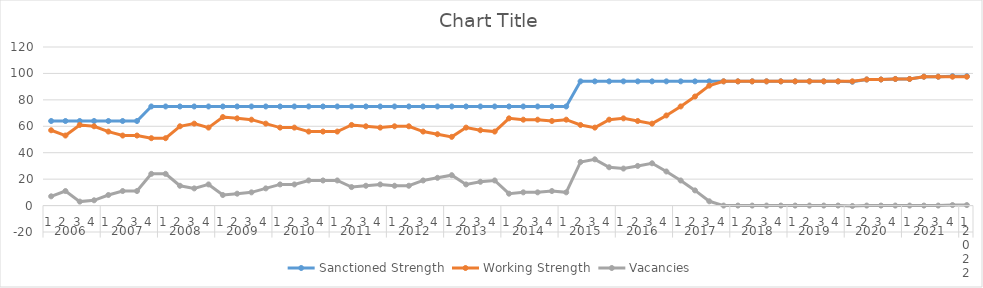
| Category | Sanctioned Strength | Working Strength | Vacancies |
|---|---|---|---|
| 0 | 64 | 57 | 7 |
| 1 | 64 | 53 | 11 |
| 2 | 64 | 61 | 3 |
| 3 | 64 | 60 | 4 |
| 4 | 64 | 56 | 8 |
| 5 | 64 | 53 | 11 |
| 6 | 64 | 53 | 11 |
| 7 | 75 | 51 | 24 |
| 8 | 75 | 51 | 24 |
| 9 | 75 | 60 | 15 |
| 10 | 75 | 62 | 13 |
| 11 | 75 | 59 | 16 |
| 12 | 75 | 67 | 8 |
| 13 | 75 | 66 | 9 |
| 14 | 75 | 65 | 10 |
| 15 | 75 | 62 | 13 |
| 16 | 75 | 59 | 16 |
| 17 | 75 | 59 | 16 |
| 18 | 75 | 56 | 19 |
| 19 | 75 | 56 | 19 |
| 20 | 75 | 56 | 19 |
| 21 | 75 | 61 | 14 |
| 22 | 75 | 60 | 15 |
| 23 | 75 | 59 | 16 |
| 24 | 75 | 60 | 15 |
| 25 | 75 | 60 | 15 |
| 26 | 75 | 56 | 19 |
| 27 | 75 | 54 | 21 |
| 28 | 75 | 52 | 23 |
| 29 | 75 | 59 | 16 |
| 30 | 75 | 57 | 18 |
| 31 | 75 | 56 | 19 |
| 32 | 75 | 66 | 9 |
| 33 | 75 | 65 | 10 |
| 34 | 75 | 65 | 10 |
| 35 | 75 | 64 | 11 |
| 36 | 75 | 65 | 10 |
| 37 | 94 | 61 | 33 |
| 38 | 94 | 59 | 35 |
| 39 | 94 | 65 | 29 |
| 40 | 94 | 66 | 28 |
| 41 | 94 | 64 | 30 |
| 42 | 94 | 62 | 32 |
| 43 | 94 | 68.2 | 25.8 |
| 44 | 94 | 75.02 | 18.98 |
| 45 | 94 | 82.522 | 11.478 |
| 46 | 94 | 90.774 | 3.226 |
| 47 | 94 | 94 | 0 |
| 48 | 94 | 94 | 0 |
| 49 | 94 | 94 | 0 |
| 50 | 94 | 94 | 0 |
| 51 | 94 | 94 | 0 |
| 52 | 94 | 94 | 0 |
| 53 | 94 | 94 | 0 |
| 54 | 94 | 94 | 0 |
| 55 | 94 | 94 | 0 |
| 56 | 93.687 | 94 | -0.313 |
| 57 | 95.415 | 95.415 | 0 |
| 58 | 95.415 | 95.415 | 0 |
| 59 | 95.813 | 95.813 | 0 |
| 60 | 95.794 | 95.794 | 0 |
| 61 | 97.521 | 97.521 | 0 |
| 62 | 97.521 | 97.521 | 0 |
| 63 | 97.92 | 97.521 | 0.399 |
| 64 | 97.901 | 97.521 | 0.379 |